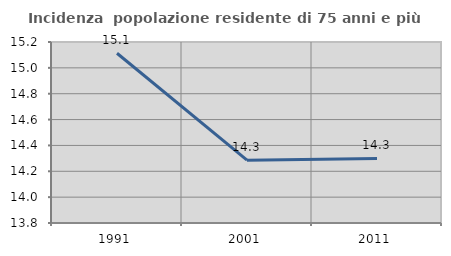
| Category | Incidenza  popolazione residente di 75 anni e più |
|---|---|
| 1991.0 | 15.113 |
| 2001.0 | 14.286 |
| 2011.0 | 14.299 |